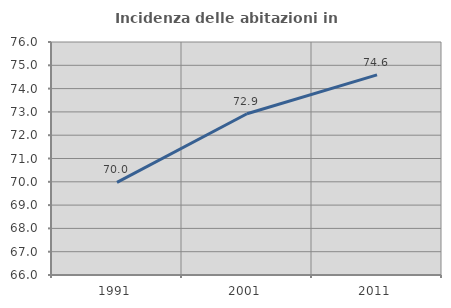
| Category | Incidenza delle abitazioni in proprietà  |
|---|---|
| 1991.0 | 69.977 |
| 2001.0 | 72.919 |
| 2011.0 | 74.591 |